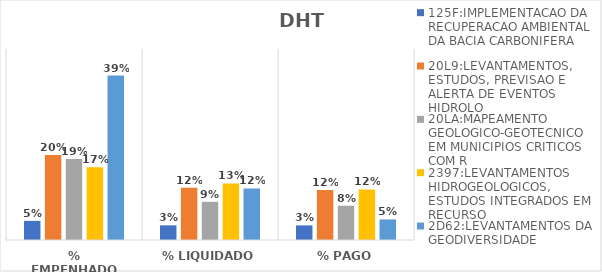
| Category | 125F:IMPLEMENTACAO DA RECUPERACAO AMBIENTAL DA BACIA CARBONIFERA | 20L9:LEVANTAMENTOS, ESTUDOS, PREVISAO E ALERTA DE EVENTOS HIDROLO | 20LA:MAPEAMENTO GEOLOGICO-GEOTECNICO EM MUNICIPIOS CRITICOS COM R | 2397:LEVANTAMENTOS HIDROGEOLOGICOS, ESTUDOS INTEGRADOS EM RECURSO | 2D62:LEVANTAMENTOS DA GEODIVERSIDADE |
|---|---|---|---|---|---|
| % EMPENHADO | 0.045 | 0.2 | 0.191 | 0.171 | 0.388 |
| % LIQUIDADO | 0.035 | 0.123 | 0.09 | 0.133 | 0.121 |
| % PAGO | 0.034 | 0.118 | 0.081 | 0.119 | 0.048 |